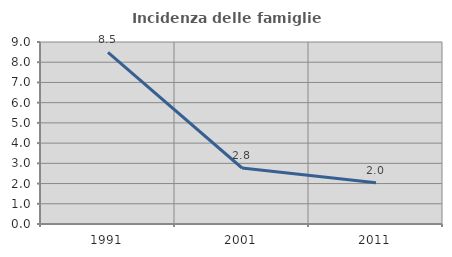
| Category | Incidenza delle famiglie numerose |
|---|---|
| 1991.0 | 8.488 |
| 2001.0 | 2.769 |
| 2011.0 | 2.045 |